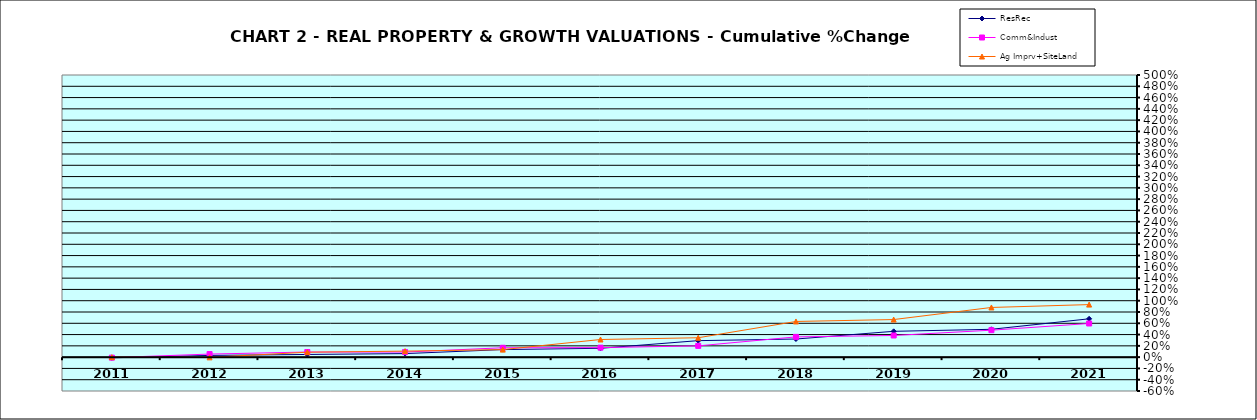
| Category | ResRec | Comm&Indust | Ag Imprv+SiteLand |
|---|---|---|---|
| 2011.0 | -0.011 | -0.009 | 0 |
| 2012.0 | 0.031 | 0.054 | -0.004 |
| 2013.0 | 0.048 | 0.091 | 0.088 |
| 2014.0 | 0.063 | 0.09 | 0.107 |
| 2015.0 | 0.134 | 0.166 | 0.133 |
| 2016.0 | 0.157 | 0.169 | 0.313 |
| 2017.0 | 0.292 | 0.2 | 0.344 |
| 2018.0 | 0.321 | 0.359 | 0.632 |
| 2019.0 | 0.457 | 0.384 | 0.666 |
| 2020.0 | 0.493 | 0.478 | 0.881 |
| 2021.0 | 0.679 | 0.596 | 0.931 |